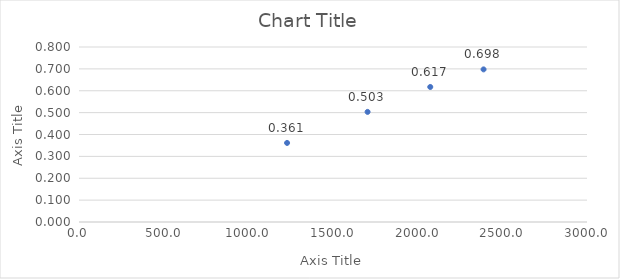
| Category | Series 0 |
|---|---|
| 1228.7333333333333 | 0.361 |
| 1704.2333333333336 | 0.503 |
| 2074.366666666667 | 0.617 |
| 2389.2000000000003 | 0.698 |